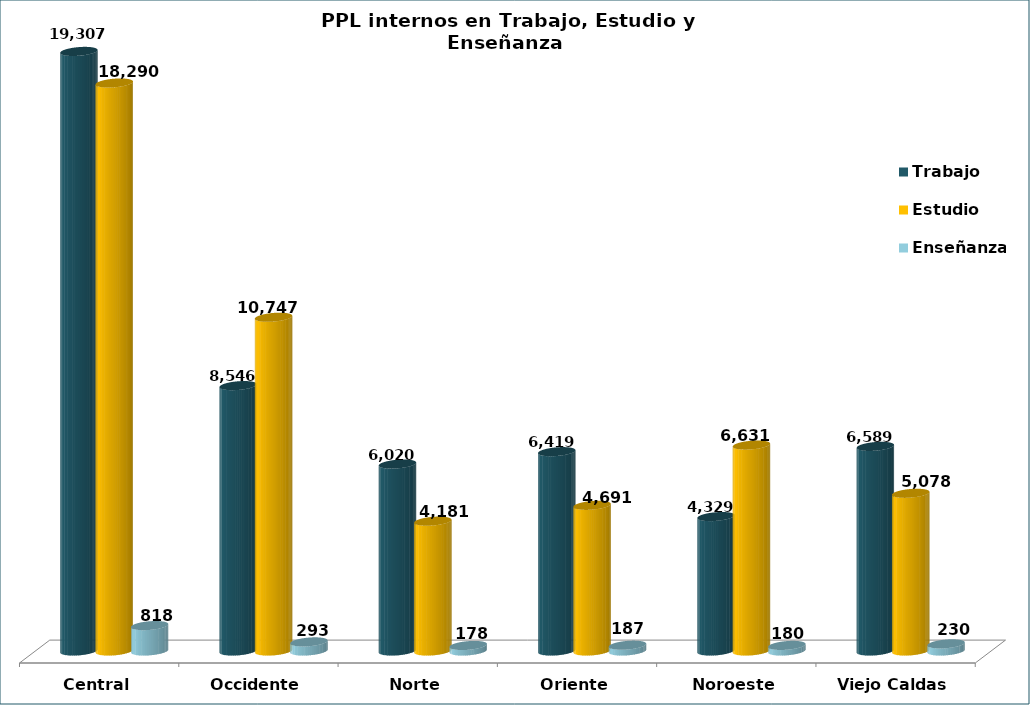
| Category | Trabajo | Estudio | Enseñanza |
|---|---|---|---|
| Central | 19307 | 18290 | 818 |
| Occidente | 8546 | 10747 | 293 |
| Norte | 6020 | 4181 | 178 |
| Oriente | 6419 | 4691 | 187 |
| Noroeste | 4329 | 6631 | 180 |
| Viejo Caldas | 6589 | 5078 | 230 |